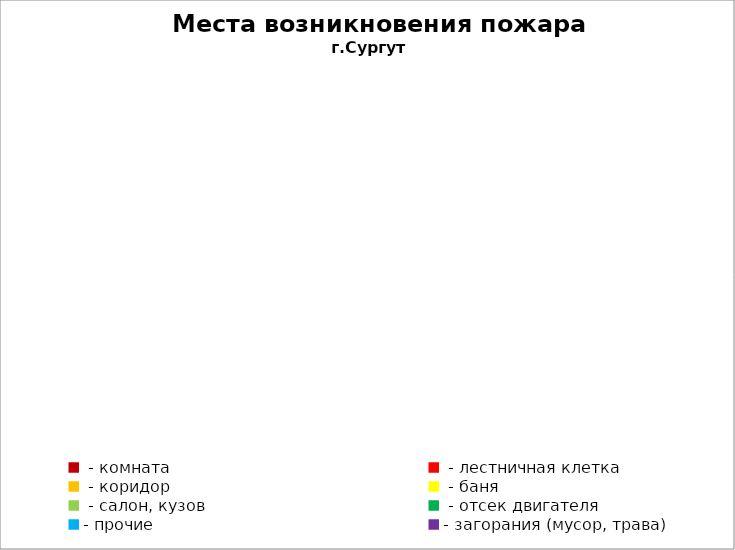
| Category | Места возникновения пожара |
|---|---|
|  - комната | 48 |
|  - лестничная клетка | 5 |
|  - коридор | 4 |
|  - баня | 23 |
|  - салон, кузов | 11 |
|  - отсек двигателя | 28 |
| - прочие | 80 |
| - загорания (мусор, трава)  | 99 |